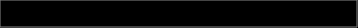
| Category | Series 0 |
|---|---|
| 0 | 0.385 |
| 1 | 0.06 |
| 2 | 0.153 |
| 3 | 0.315 |
| 4 | 0.087 |